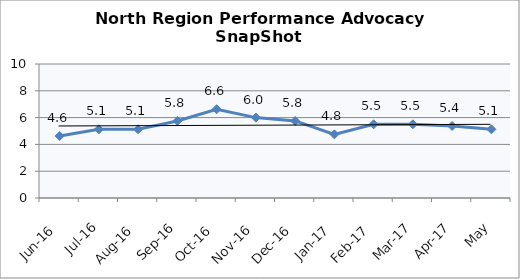
| Category | North Region |
|---|---|
| Jun-16 | 4.625 |
| Jul-16 | 5.125 |
| Aug-16 | 5.125 |
| Sep-16 | 5.75 |
| Oct-16 | 6.625 |
| Nov-16 | 6 |
| Dec-16 | 5.75 |
| Jan-17 | 4.75 |
| Feb-17 | 5.5 |
| Mar-17 | 5.5 |
| Apr-17 | 5.375 |
| May | 5.125 |